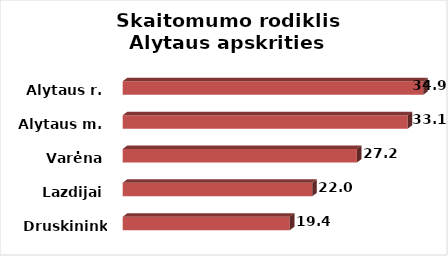
| Category | Series 0 |
|---|---|
| Druskininkai | 19.4 |
| Lazdijai | 22 |
| Varėna | 27.2 |
| Alytaus m. | 33.1 |
| Alytaus r. | 34.9 |